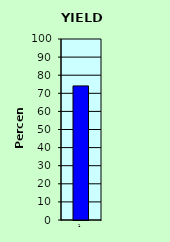
| Category | Series 0 |
|---|---|
| 0 | 74.084 |